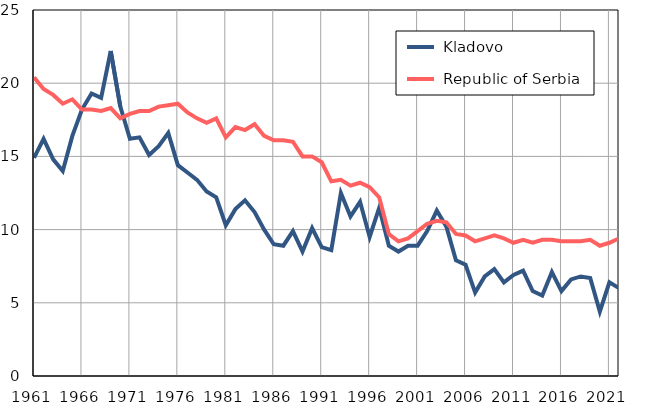
| Category |  Kladovo |  Republic of Serbia |
|---|---|---|
| 1961.0 | 14.9 | 20.4 |
| 1962.0 | 16.2 | 19.6 |
| 1963.0 | 14.8 | 19.2 |
| 1964.0 | 14 | 18.6 |
| 1965.0 | 16.4 | 18.9 |
| 1966.0 | 18.2 | 18.2 |
| 1967.0 | 19.3 | 18.2 |
| 1968.0 | 19 | 18.1 |
| 1969.0 | 22.2 | 18.3 |
| 1970.0 | 18.4 | 17.6 |
| 1971.0 | 16.2 | 17.9 |
| 1972.0 | 16.3 | 18.1 |
| 1973.0 | 15.1 | 18.1 |
| 1974.0 | 15.7 | 18.4 |
| 1975.0 | 16.6 | 18.5 |
| 1976.0 | 14.4 | 18.6 |
| 1977.0 | 13.9 | 18 |
| 1978.0 | 13.4 | 17.6 |
| 1979.0 | 12.6 | 17.3 |
| 1980.0 | 12.2 | 17.6 |
| 1981.0 | 10.3 | 16.3 |
| 1982.0 | 11.4 | 17 |
| 1983.0 | 12 | 16.8 |
| 1984.0 | 11.2 | 17.2 |
| 1985.0 | 10 | 16.4 |
| 1986.0 | 9 | 16.1 |
| 1987.0 | 8.9 | 16.1 |
| 1988.0 | 9.9 | 16 |
| 1989.0 | 8.5 | 15 |
| 1990.0 | 10.1 | 15 |
| 1991.0 | 8.8 | 14.6 |
| 1992.0 | 8.6 | 13.3 |
| 1993.0 | 12.5 | 13.4 |
| 1994.0 | 10.9 | 13 |
| 1995.0 | 11.9 | 13.2 |
| 1996.0 | 9.5 | 12.9 |
| 1997.0 | 11.5 | 12.2 |
| 1998.0 | 8.9 | 9.7 |
| 1999.0 | 8.5 | 9.2 |
| 2000.0 | 8.9 | 9.4 |
| 2001.0 | 8.9 | 9.9 |
| 2002.0 | 9.9 | 10.4 |
| 2003.0 | 11.3 | 10.6 |
| 2004.0 | 10.2 | 10.5 |
| 2005.0 | 7.9 | 9.7 |
| 2006.0 | 7.6 | 9.6 |
| 2007.0 | 5.7 | 9.2 |
| 2008.0 | 6.8 | 9.4 |
| 2009.0 | 7.3 | 9.6 |
| 2010.0 | 6.4 | 9.4 |
| 2011.0 | 6.9 | 9.1 |
| 2012.0 | 7.2 | 9.3 |
| 2013.0 | 5.8 | 9.1 |
| 2014.0 | 5.5 | 9.3 |
| 2015.0 | 7.1 | 9.3 |
| 2016.0 | 5.8 | 9.2 |
| 2017.0 | 6.6 | 9.2 |
| 2018.0 | 6.8 | 9.2 |
| 2019.0 | 6.7 | 9.3 |
| 2020.0 | 4.4 | 8.9 |
| 2021.0 | 6.4 | 9.1 |
| 2022.0 | 6 | 9.4 |